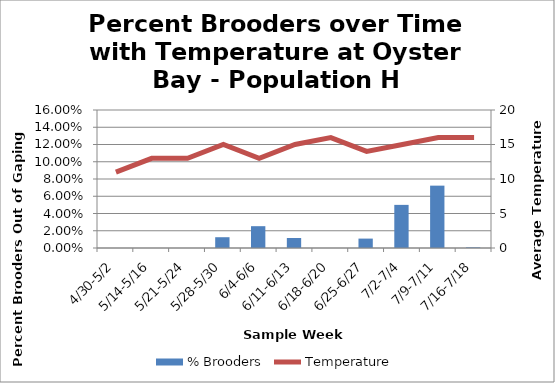
| Category | % Brooders |
|---|---|
| 4/30-5/2 | 0 |
| 5/14-5/16 | 0 |
| 5/21-5/24 | 0 |
| 5/28-5/30 | 0.012 |
| 6/4-6/6 | 0.025 |
| 6/11-6/13 | 0.012 |
| 6/18-6/20 | 0 |
| 6/25-6/27 | 0.011 |
| 7/2-7/4 | 0.05 |
| 7/9-7/11 | 0.072 |
| 7/16-7/18 | 0.001 |